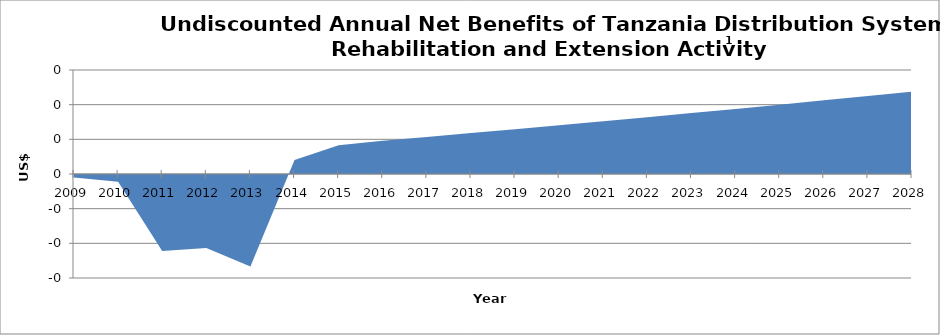
| Category | Series 0 |
|---|---|
| 2009.0 | -2.026 |
| 2010.0 | -4.536 |
| 2011.0 | -44.463 |
| 2012.0 | -42.732 |
| 2013.0 | -53.361 |
| 2014.0 | 8.149 |
| 2015.0 | 16.609 |
| 2016.0 | 19.201 |
| 2017.0 | 21.381 |
| 2018.0 | 23.592 |
| 2019.0 | 25.835 |
| 2020.0 | 28.112 |
| 2021.0 | 30.421 |
| 2022.0 | 32.764 |
| 2023.0 | 35.142 |
| 2024.0 | 37.556 |
| 2025.0 | 40.006 |
| 2026.0 | 42.492 |
| 2027.0 | 45.017 |
| 2028.0 | 47.58 |